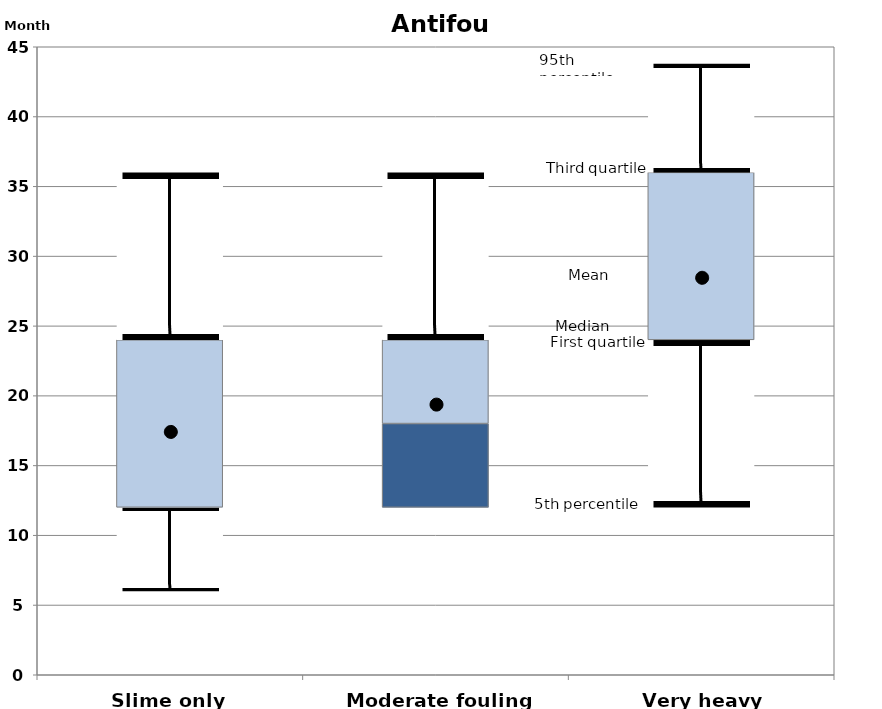
| Category | 5th percentile | First quartile | Second quartile | Third quartile | 95th percentile |
|---|---|---|---|---|---|
| Slime only | 6 | 6 | 0 | 12 | 12 |
| Moderate fouling | 12 | 0 | 6 | 6 | 12 |
| Very heavy fouling | 12 | 12 | 0 | 12 | 7.8 |